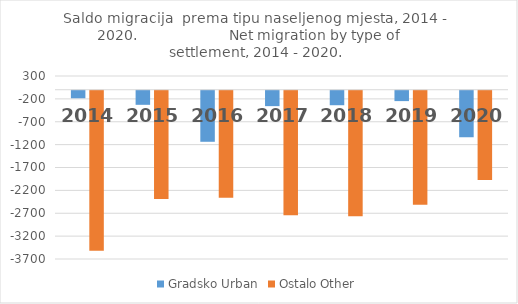
| Category | Gradsko Urban | Ostalo Other |
|---|---|---|
| 2014.0 | -165 | -3499 |
| 2015.0 | -308 | -2366 |
| 2016.0 | -1116 | -2339 |
| 2017.0 | -337 | -2724 |
| 2018.0 | -317 | -2744 |
| 2019.0 | -227 | -2490 |
| 2020.0 | -1017 | -1951 |